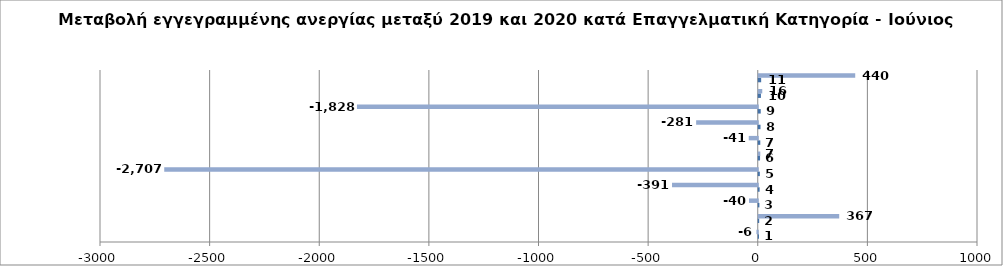
| Category | Series 0 | Series 1 |
|---|---|---|
| 0 | 1 | -6 |
| 1 | 2 | 367 |
| 2 | 3 | -40 |
| 3 | 4 | -391 |
| 4 | 5 | -2707 |
| 5 | 6 | 7 |
| 6 | 7 | -41 |
| 7 | 8 | -281 |
| 8 | 9 | -1828 |
| 9 | 10 | 16 |
| 10 | 11 | 440 |